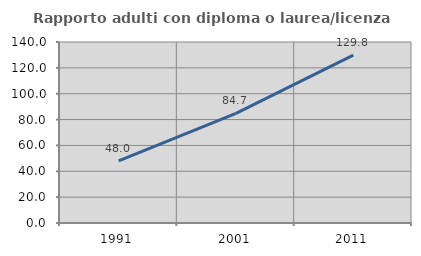
| Category | Rapporto adulti con diploma o laurea/licenza media  |
|---|---|
| 1991.0 | 48.042 |
| 2001.0 | 84.737 |
| 2011.0 | 129.789 |